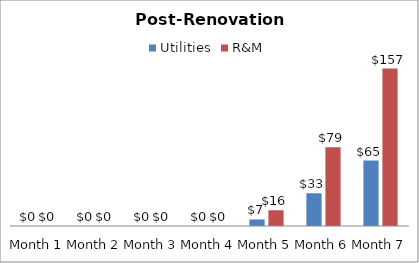
| Category | Utilities | R&M |
|---|---|---|
| 0 | 0 | 0 |
| 1 | 0 | 0 |
| 2 | 0 | 0 |
| 3 | 0 | 0 |
| 4 | 6.545 | 15.739 |
| 5 | 32.726 | 78.694 |
| 6 | 65.452 | 157.388 |